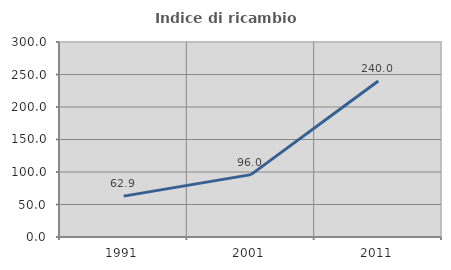
| Category | Indice di ricambio occupazionale  |
|---|---|
| 1991.0 | 62.871 |
| 2001.0 | 95.973 |
| 2011.0 | 240 |